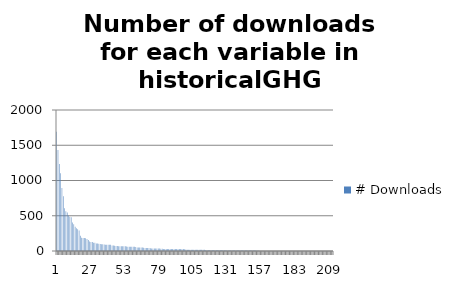
| Category | # Downloads |
|---|---|
| 0 | 1692 |
| 1 | 1434 |
| 2 | 1233 |
| 3 | 1104 |
| 4 | 894 |
| 5 | 776 |
| 6 | 605 |
| 7 | 564 |
| 8 | 546 |
| 9 | 504 |
| 10 | 486 |
| 11 | 477 |
| 12 | 405 |
| 13 | 380 |
| 14 | 345 |
| 15 | 324 |
| 16 | 309 |
| 17 | 291 |
| 18 | 216 |
| 19 | 189 |
| 20 | 186 |
| 21 | 183 |
| 22 | 180 |
| 23 | 171 |
| 24 | 157 |
| 25 | 135 |
| 26 | 129 |
| 27 | 129 |
| 28 | 117 |
| 29 | 117 |
| 30 | 108 |
| 31 | 105 |
| 32 | 104 |
| 33 | 99 |
| 34 | 96 |
| 35 | 96 |
| 36 | 93 |
| 37 | 90 |
| 38 | 90 |
| 39 | 90 |
| 40 | 90 |
| 41 | 87 |
| 42 | 78 |
| 43 | 78 |
| 44 | 75 |
| 45 | 72 |
| 46 | 72 |
| 47 | 69 |
| 48 | 66 |
| 49 | 66 |
| 50 | 66 |
| 51 | 66 |
| 52 | 66 |
| 53 | 63 |
| 54 | 60 |
| 55 | 60 |
| 56 | 60 |
| 57 | 60 |
| 58 | 60 |
| 59 | 60 |
| 60 | 57 |
| 61 | 51 |
| 62 | 51 |
| 63 | 48 |
| 64 | 48 |
| 65 | 48 |
| 66 | 45 |
| 67 | 42 |
| 68 | 42 |
| 69 | 42 |
| 70 | 42 |
| 71 | 39 |
| 72 | 36 |
| 73 | 36 |
| 74 | 36 |
| 75 | 36 |
| 76 | 36 |
| 77 | 36 |
| 78 | 36 |
| 79 | 33 |
| 80 | 32 |
| 81 | 30 |
| 82 | 30 |
| 83 | 30 |
| 84 | 30 |
| 85 | 30 |
| 86 | 30 |
| 87 | 30 |
| 88 | 30 |
| 89 | 30 |
| 90 | 30 |
| 91 | 30 |
| 92 | 30 |
| 93 | 30 |
| 94 | 30 |
| 95 | 30 |
| 96 | 27 |
| 97 | 24 |
| 98 | 20 |
| 99 | 18 |
| 100 | 18 |
| 101 | 18 |
| 102 | 18 |
| 103 | 18 |
| 104 | 18 |
| 105 | 18 |
| 106 | 18 |
| 107 | 18 |
| 108 | 18 |
| 109 | 18 |
| 110 | 18 |
| 111 | 18 |
| 112 | 18 |
| 113 | 12 |
| 114 | 12 |
| 115 | 12 |
| 116 | 12 |
| 117 | 12 |
| 118 | 12 |
| 119 | 12 |
| 120 | 12 |
| 121 | 12 |
| 122 | 12 |
| 123 | 12 |
| 124 | 12 |
| 125 | 9 |
| 126 | 9 |
| 127 | 9 |
| 128 | 8 |
| 129 | 6 |
| 130 | 6 |
| 131 | 6 |
| 132 | 6 |
| 133 | 6 |
| 134 | 6 |
| 135 | 6 |
| 136 | 6 |
| 137 | 6 |
| 138 | 6 |
| 139 | 6 |
| 140 | 6 |
| 141 | 6 |
| 142 | 6 |
| 143 | 6 |
| 144 | 6 |
| 145 | 6 |
| 146 | 6 |
| 147 | 6 |
| 148 | 6 |
| 149 | 6 |
| 150 | 6 |
| 151 | 6 |
| 152 | 3 |
| 153 | 3 |
| 154 | 0 |
| 155 | 0 |
| 156 | 0 |
| 157 | 0 |
| 158 | 0 |
| 159 | 0 |
| 160 | 0 |
| 161 | 0 |
| 162 | 0 |
| 163 | 0 |
| 164 | 0 |
| 165 | 0 |
| 166 | 0 |
| 167 | 0 |
| 168 | 0 |
| 169 | 0 |
| 170 | 0 |
| 171 | 0 |
| 172 | 0 |
| 173 | 0 |
| 174 | 0 |
| 175 | 0 |
| 176 | 0 |
| 177 | 0 |
| 178 | 0 |
| 179 | 0 |
| 180 | 0 |
| 181 | 0 |
| 182 | 0 |
| 183 | 0 |
| 184 | 0 |
| 185 | 0 |
| 186 | 0 |
| 187 | 0 |
| 188 | 0 |
| 189 | 0 |
| 190 | 0 |
| 191 | 0 |
| 192 | 0 |
| 193 | 0 |
| 194 | 0 |
| 195 | 0 |
| 196 | 0 |
| 197 | 0 |
| 198 | 0 |
| 199 | 0 |
| 200 | 0 |
| 201 | 0 |
| 202 | 0 |
| 203 | 0 |
| 204 | 0 |
| 205 | 0 |
| 206 | 0 |
| 207 | 0 |
| 208 | 0 |
| 209 | 0 |